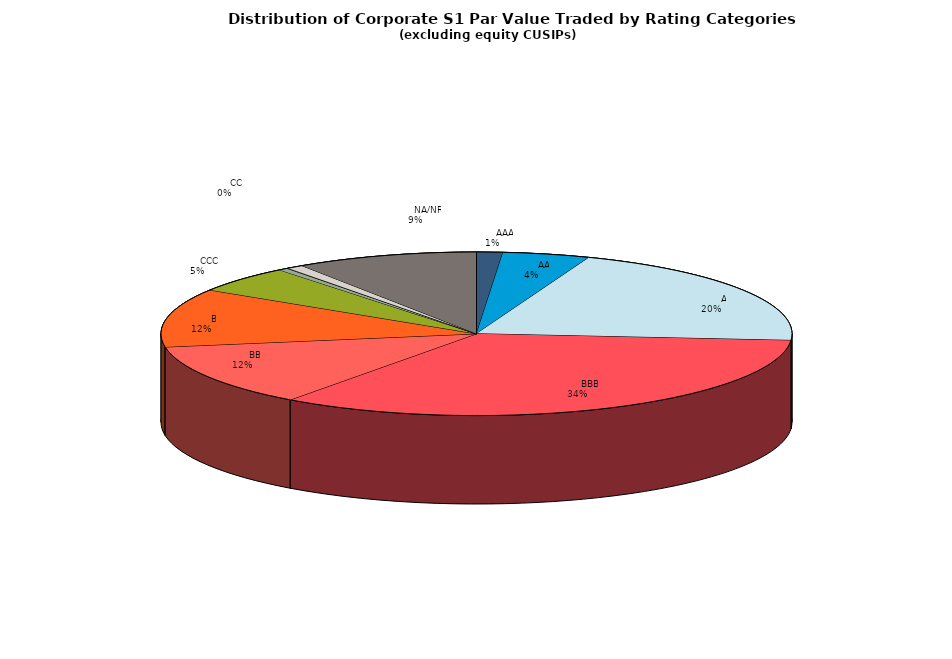
| Category | Series 0 |
|---|---|
|         AAA | 431370878.821 |
|         AA | 1435466627.948 |
|         A | 6592868836.906 |
|         BBB | 10859513922.618 |
|         BB | 3979895247.698 |
|         B | 3722717523.664 |
|         CCC | 1700350109.892 |
|         CC | 155493173.537 |
|         C | 23042148.525 |
|         D | 271118378.461 |
|         NA/NR | 3002133015.029 |